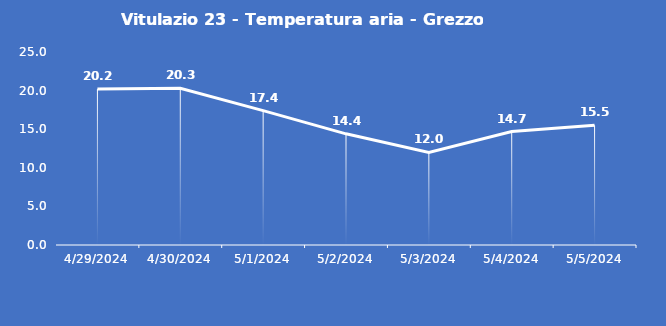
| Category | Vitulazio 23 - Temperatura aria - Grezzo (°C) |
|---|---|
| 4/29/24 | 20.2 |
| 4/30/24 | 20.3 |
| 5/1/24 | 17.4 |
| 5/2/24 | 14.4 |
| 5/3/24 | 12 |
| 5/4/24 | 14.7 |
| 5/5/24 | 15.5 |